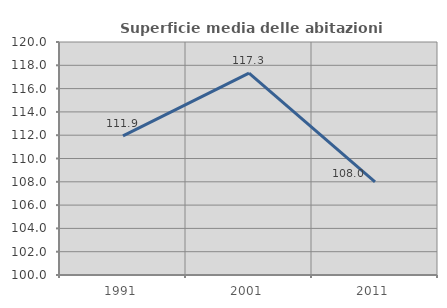
| Category | Superficie media delle abitazioni occupate |
|---|---|
| 1991.0 | 111.945 |
| 2001.0 | 117.332 |
| 2011.0 | 107.993 |